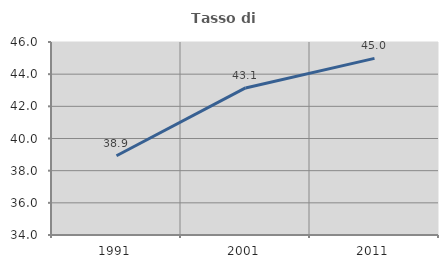
| Category | Tasso di occupazione   |
|---|---|
| 1991.0 | 38.929 |
| 2001.0 | 43.144 |
| 2011.0 | 44.98 |